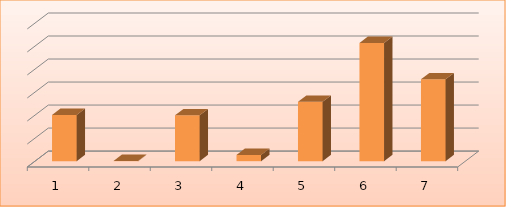
| Category | Series 0 |
|---|---|
| 0 | 10051672 |
| 1 | 44100 |
| 2 | 9953343 |
| 3 | 1363548 |
| 4 | 12899254 |
| 5 | 25692746 |
| 6 | 17777219 |